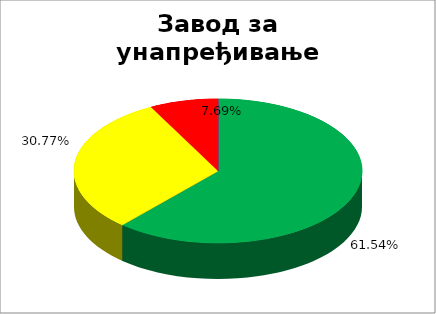
| Category | Завод за унапређивање образовања и васпитања  |
|---|---|
| 0 | 0.615 |
| 1 | 0 |
| 2 | 0.308 |
| 3 | 0.077 |
| 4 | 0 |